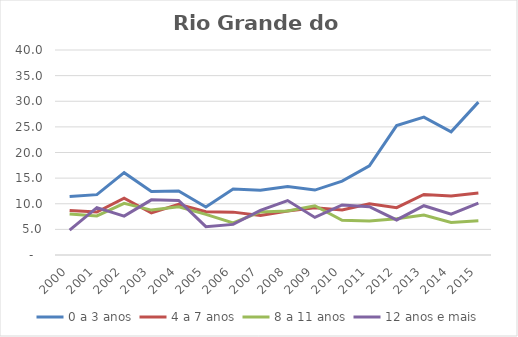
| Category | 0 a 3 anos | 4 a 7 anos | 8 a 11 anos | 12 anos e mais |
|---|---|---|---|---|
| 2000.0 | 11.394 | 8.705 | 8.002 | 4.856 |
| 2001.0 | 11.777 | 8.395 | 7.618 | 9.245 |
| 2002.0 | 16.059 | 11.107 | 10.082 | 7.579 |
| 2003.0 | 12.392 | 8.202 | 8.764 | 10.758 |
| 2004.0 | 12.51 | 9.887 | 9.405 | 10.634 |
| 2005.0 | 9.352 | 8.46 | 7.934 | 5.531 |
| 2006.0 | 12.885 | 8.365 | 6.253 | 5.972 |
| 2007.0 | 12.619 | 7.711 | 8.408 | 8.699 |
| 2008.0 | 13.363 | 8.6 | 8.586 | 10.617 |
| 2009.0 | 12.672 | 9.208 | 9.603 | 7.332 |
| 2010.0 | 14.413 | 8.796 | 6.783 | 9.757 |
| 2011.0 | 17.413 | 9.981 | 6.628 | 9.427 |
| 2012.0 | 25.243 | 9.239 | 7.079 | 6.84 |
| 2013.0 | 26.912 | 11.814 | 7.811 | 9.612 |
| 2014.0 | 24.045 | 11.521 | 6.366 | 7.98 |
| 2015.0 | 29.831 | 12.091 | 6.671 | 10.107 |